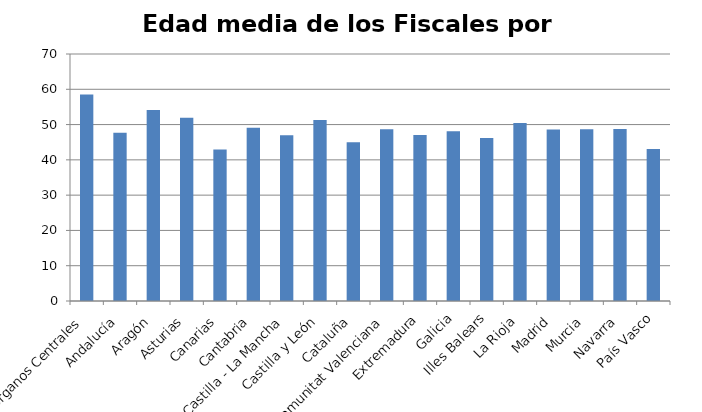
| Category | Edad Media |
|---|---|
| Órganos Centrales | 58.53 |
| Andalucía | 47.67 |
| Aragón | 54.16 |
| Asturias | 51.95 |
| Canarias | 42.96 |
| Cantabria | 49.13 |
| Castilla - La Mancha | 46.98 |
| Castilla y León | 51.3 |
| Cataluña | 44.98 |
| Comunitat Valenciana | 48.66 |
| Extremadura | 47.02 |
| Galicia | 48.14 |
| Illes Balears | 46.19 |
| La Rioja | 50.41 |
| Madrid | 48.59 |
| Murcia | 48.67 |
| Navarra | 48.72 |
| País Vasco | 43.11 |